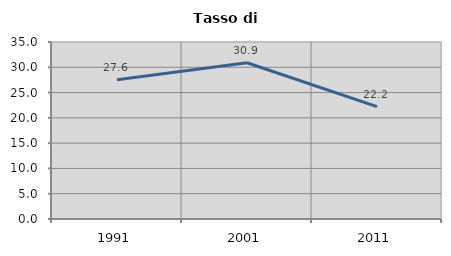
| Category | Tasso di disoccupazione   |
|---|---|
| 1991.0 | 27.554 |
| 2001.0 | 30.888 |
| 2011.0 | 22.232 |